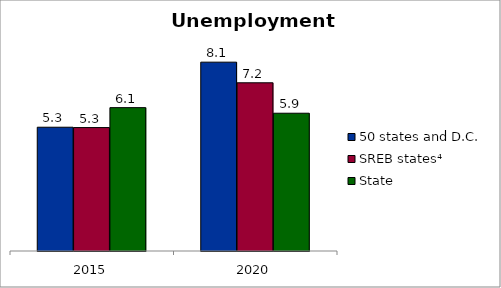
| Category | 50 states and D.C. | SREB states⁴ | State |
|---|---|---|---|
| 2015.0 | 5.28 | 5.265 | 6.115 |
| 2020.0 | 8.055 | 7.175 | 5.877 |